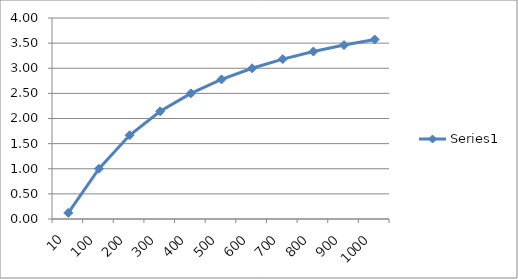
| Category | Series 0 |
|---|---|
| 10.0 | 0.122 |
| 100.0 | 1 |
| 200.0 | 1.667 |
| 300.0 | 2.143 |
| 400.0 | 2.5 |
| 500.0 | 2.778 |
| 600.0 | 3 |
| 700.0 | 3.182 |
| 800.0 | 3.333 |
| 900.0 | 3.462 |
| 1000.0 | 3.571 |